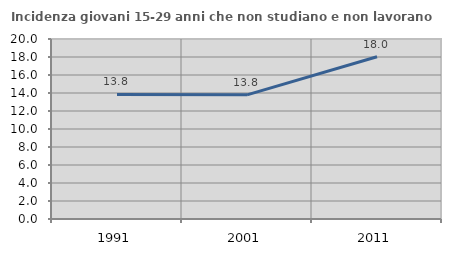
| Category | Incidenza giovani 15-29 anni che non studiano e non lavorano  |
|---|---|
| 1991.0 | 13.841 |
| 2001.0 | 13.793 |
| 2011.0 | 18.028 |